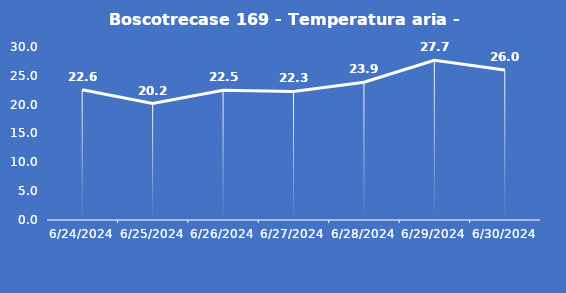
| Category | Boscotrecase 169 - Temperatura aria - Grezzo (°C) |
|---|---|
| 6/24/24 | 22.6 |
| 6/25/24 | 20.2 |
| 6/26/24 | 22.5 |
| 6/27/24 | 22.3 |
| 6/28/24 | 23.9 |
| 6/29/24 | 27.7 |
| 6/30/24 | 26 |